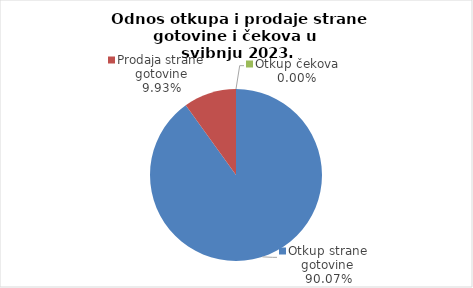
| Category | Series 0 |
|---|---|
| Otkup strane gotovine | 90.073 |
| Prodaja strane gotovine | 9.927 |
| Otkup čekova | 0 |